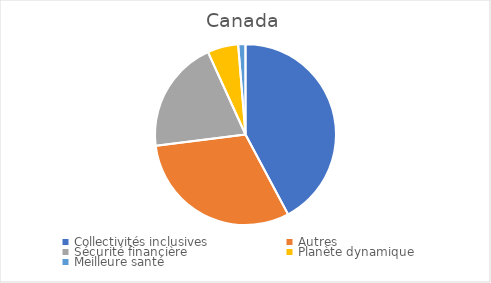
| Category | Series 0 |
|---|---|
| Collectivités inclusives | 42.2 |
| Autres | 30.8 |
| Sécurité financière | 20.2 |
| Planète dynamique | 5.5 |
| Meilleure santé | 1.3 |